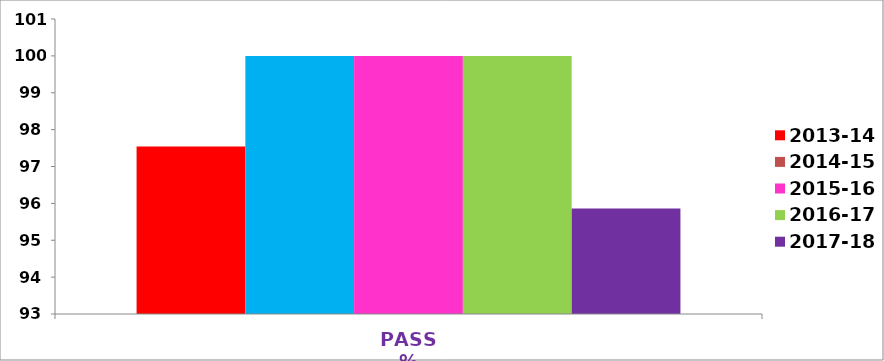
| Category | 2013-14 | 2014-15 | 2015-16 | 2016-17 | 2017-18 |
|---|---|---|---|---|---|
| PASS % | 97.54 | 100 | 100 | 100 | 95.86 |